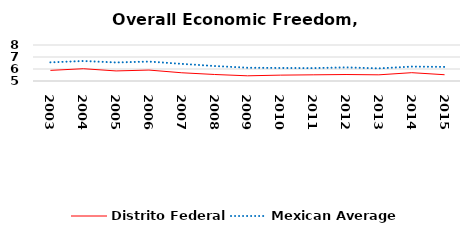
| Category | Distrito Federal  | Mexican Average  |
|---|---|---|
| 2003.0 | 5.884 | 6.552 |
| 2004.0 | 6.024 | 6.668 |
| 2005.0 | 5.839 | 6.546 |
| 2006.0 | 5.911 | 6.619 |
| 2007.0 | 5.685 | 6.428 |
| 2008.0 | 5.542 | 6.248 |
| 2009.0 | 5.433 | 6.106 |
| 2010.0 | 5.489 | 6.086 |
| 2011.0 | 5.515 | 6.074 |
| 2012.0 | 5.54 | 6.134 |
| 2013.0 | 5.514 | 6.054 |
| 2014.0 | 5.693 | 6.2 |
| 2015.0 | 5.523 | 6.174 |